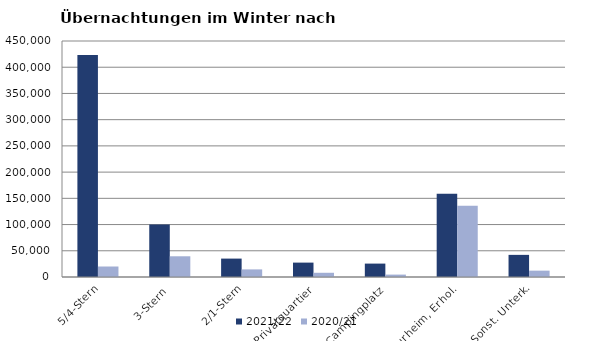
| Category | 2021/22 | 2020/21 |
|---|---|---|
| 5/4-Stern | 423117 | 20005 |
| 3-Stern | 100112 | 39513 |
| 2/1-Stern | 35098 | 14492 |
| Privatquartier | 27442 | 8052 |
| Campingplatz | 25559 | 4589 |
| Kurheim, Erhol. | 158604 | 135678 |
| Sonst. Unterk. | 42189 | 12110 |